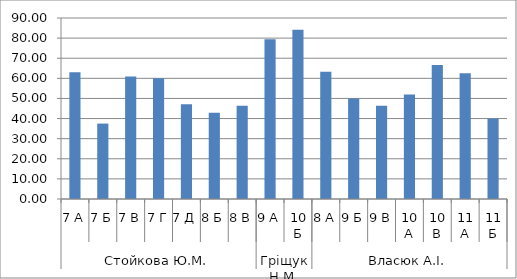
| Category | Series 0 |
|---|---|
| 0 | 62.963 |
| 1 | 37.5 |
| 2 | 60.87 |
| 3 | 60 |
| 4 | 47.059 |
| 5 | 42.857 |
| 6 | 46.429 |
| 7 | 79.412 |
| 8 | 84.211 |
| 9 | 63.333 |
| 10 | 50 |
| 11 | 46.429 |
| 12 | 52 |
| 13 | 66.667 |
| 14 | 62.5 |
| 15 | 40 |